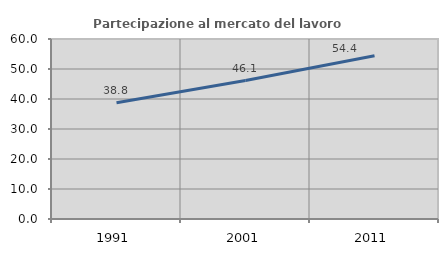
| Category | Partecipazione al mercato del lavoro  femminile |
|---|---|
| 1991.0 | 38.765 |
| 2001.0 | 46.146 |
| 2011.0 | 54.419 |